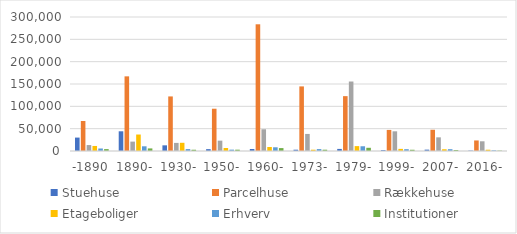
| Category | Stuehuse | Parcelhuse | Rækkehuse | Etageboliger | Erhverv | Institutioner |
|---|---|---|---|---|---|---|
| -1890 | 30047 | 67234 | 13315 | 11286 | 5608 | 4238 |
| 1890- | 44133 | 167122 | 21021 | 36891 | 10514 | 5798 |
| 1930- | 12677 | 122172 | 18132 | 18392 | 4251 | 2821 |
| 1950- | 4177 | 94650 | 23162 | 6705 | 3024 | 2953 |
| 1960- | 4492 | 283682 | 48661 | 9004 | 8324 | 6518 |
| 1973- | 2924 | 144622 | 38195 | 2876 | 4281 | 2890 |
| 1979- | 4661 | 122815 | 155579 | 10952 | 10598 | 7186 |
| 1999- | 2081 | 47191 | 44085 | 4752 | 4024 | 2771 |
| 2007- | 3070 | 47558 | 30594 | 3881 | 4057 | 2209 |
| 2016- | 923 | 23619 | 21739 | 2881 | 1458 | 859 |